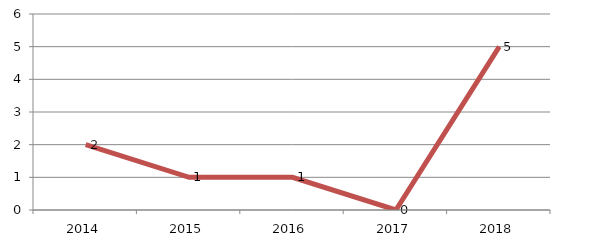
| Category | Total ... ... ... |
|---|---|
| 2014.0 | 2 |
| 2015.0 | 1 |
| 2016.0 | 1 |
| 2017.0 | 0 |
| 2018.0 | 5 |